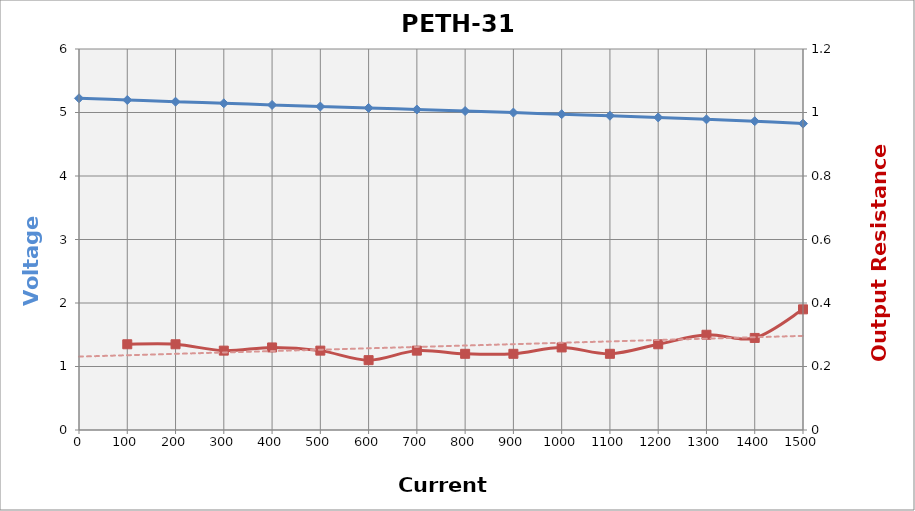
| Category | Series 0 |
|---|---|
| 0.0 | 5.224 |
| 100.0 | 5.197 |
| 200.0 | 5.17 |
| 300.0 | 5.145 |
| 400.0 | 5.119 |
| 500.0 | 5.094 |
| 600.0 | 5.072 |
| 700.0 | 5.047 |
| 800.0 | 5.023 |
| 900.0 | 4.999 |
| 1000.0 | 4.973 |
| 1100.0 | 4.949 |
| 1200.0 | 4.922 |
| 1300.0 | 4.892 |
| 1400.0 | 4.863 |
| 1500.0 | 4.825 |